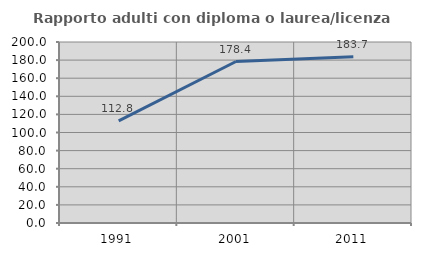
| Category | Rapporto adulti con diploma o laurea/licenza media  |
|---|---|
| 1991.0 | 112.809 |
| 2001.0 | 178.422 |
| 2011.0 | 183.745 |